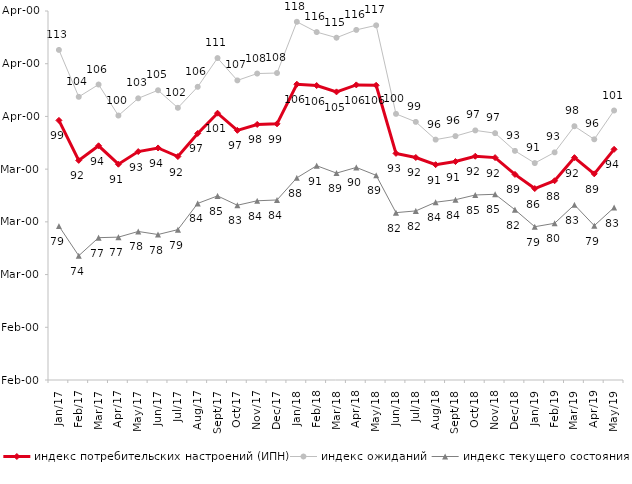
| Category | индекс потребительских настроений (ИПН) | Series 0 | индекс ожиданий | Series 3 | индекс текущего состояния |
|---|---|---|---|---|---|
| 2017-01-01 | 99.25 | 2017-01-01 | 112.617 | 2017-01-01 | 79.2 |
| 2017-02-01 | 91.66 | 2017-02-01 | 103.717 | 2017-02-01 | 73.575 |
| 2017-03-01 | 94.43 | 2017-03-01 | 106.05 | 2017-03-01 | 77 |
| 2017-04-01 | 90.94 | 2017-04-01 | 100.167 | 2017-04-01 | 77.1 |
| 2017-05-01 | 93.33 | 2017-05-01 | 103.433 | 2017-05-01 | 78.175 |
| 2017-06-01 | 94.02 | 2017-06-01 | 104.967 | 2017-06-01 | 77.6 |
| 2017-07-01 | 92.39 | 2017-07-01 | 101.633 | 2017-07-01 | 78.525 |
| 2017-08-01 | 96.77 | 2017-08-01 | 105.617 | 2017-08-01 | 83.5 |
| 2017-09-01 | 100.61 | 2017-09-01 | 111.067 | 2017-09-01 | 84.925 |
| 2017-10-01 | 97.36 | 2017-10-01 | 106.833 | 2017-10-01 | 83.15 |
| 2017-11-01 | 98.48 | 2017-11-01 | 108.133 | 2017-11-01 | 84 |
| 2017-12-01 | 98.6 | 2017-12-01 | 108.233 | 2017-12-01 | 84.15 |
| 2018-01-01 | 106.11 | 2018-01-01 | 117.95 | 2018-01-01 | 88.35 |
| 2018-02-01 | 105.86 | 2018-02-01 | 116 | 2018-02-01 | 90.65 |
| 2018-03-01 | 104.66 | 2018-03-01 | 114.933 | 2018-03-01 | 89.25 |
| 2018-04-01 | 105.98 | 2018-04-01 | 116.417 | 2018-04-01 | 90.325 |
| 2018-05-01 | 105.9 | 2018-05-01 | 117.283 | 2018-05-01 | 88.825 |
| 2018-06-01 | 92.99 | 2018-06-01 | 100.483 | 2018-06-01 | 81.75 |
| 2018-07-01 | 92.21 | 2018-07-01 | 98.967 | 2018-07-01 | 82.075 |
| 2018-08-01 | 90.85 | 2018-08-01 | 95.6 | 2018-08-01 | 83.725 |
| 2018-09-01 | 91.44 | 2018-09-01 | 96.267 | 2018-09-01 | 84.2 |
| 2018-10-01 | 92.45 | 2018-10-01 | 97.35 | 2018-10-01 | 85.1 |
| 2018-11-01 | 92.186 | 2018-11-01 | 96.823 | 2018-11-01 | 85.23 |
| 2018-12-01 | 89 | 2018-12-01 | 93.467 | 2018-12-01 | 82.3 |
| 2019-01-01 | 86.32 | 2019-01-01 | 91.15 | 2019-01-01 | 79.075 |
| 2019-02-01 | 87.8 | 2019-02-01 | 93.183 | 2019-02-01 | 79.725 |
| 2019-03-01 | 92.183 | 2019-03-01 | 98.144 | 2019-03-01 | 83.242 |
| 2019-04-01 | 89.109 | 2019-04-01 | 95.66 | 2019-04-01 | 79.282 |
| 2019-05-01 | 93.759 | 2019-05-01 | 101.123 | 2019-05-01 | 82.714 |